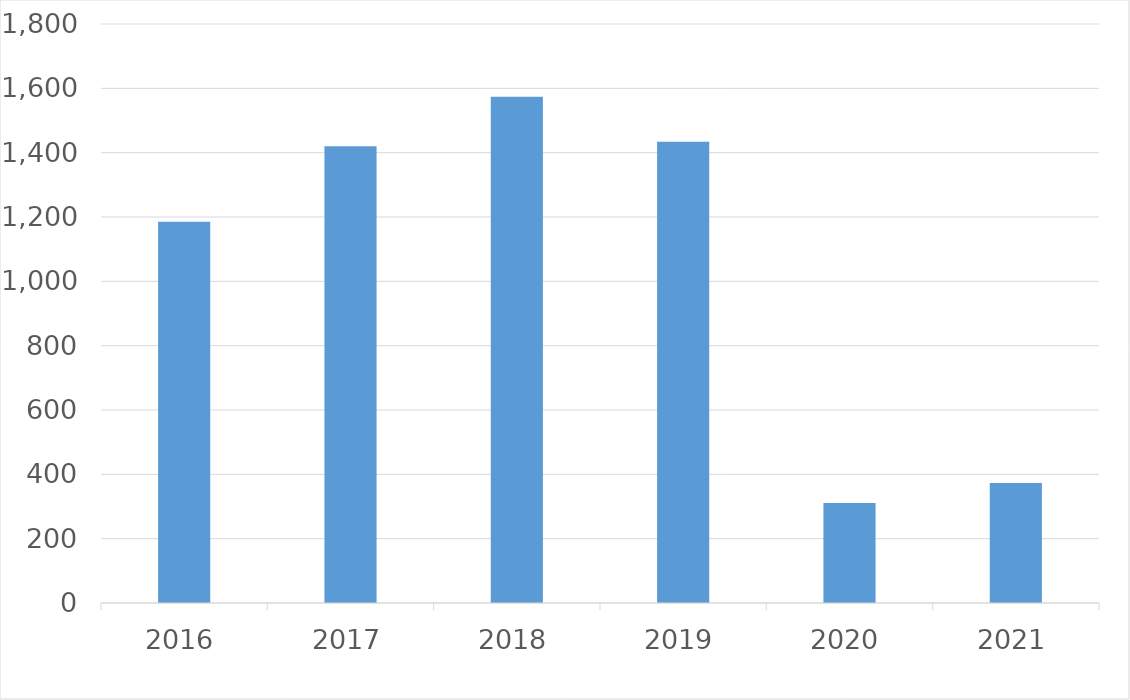
| Category | Series 0 |
|---|---|
| 2016 | 1185 |
| 2017 | 1420 |
| 2018 | 1574 |
| 2019 | 1434 |
| 2020 | 311 |
| 2021 | 373 |